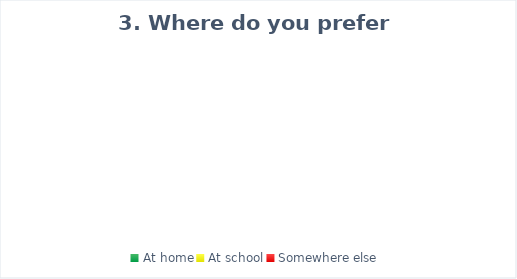
| Category | Series 0 |
|---|---|
| At home | 0 |
| At school | 0 |
| Somewhere else | 0 |